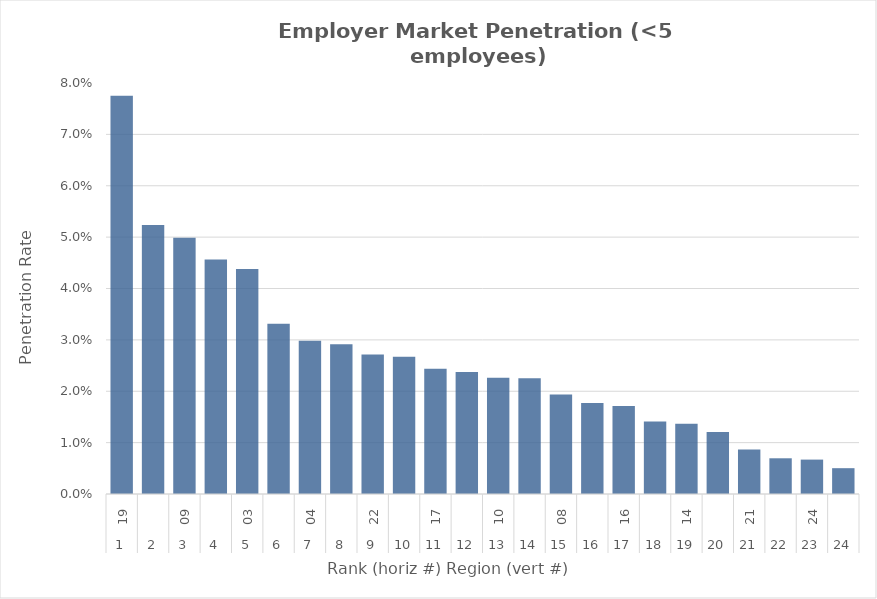
| Category | Rate |
|---|---|
| 0 | 0.078 |
| 1 | 0.052 |
| 2 | 0.05 |
| 3 | 0.046 |
| 4 | 0.044 |
| 5 | 0.033 |
| 6 | 0.03 |
| 7 | 0.029 |
| 8 | 0.027 |
| 9 | 0.027 |
| 10 | 0.024 |
| 11 | 0.024 |
| 12 | 0.023 |
| 13 | 0.023 |
| 14 | 0.019 |
| 15 | 0.018 |
| 16 | 0.017 |
| 17 | 0.014 |
| 18 | 0.014 |
| 19 | 0.012 |
| 20 | 0.009 |
| 21 | 0.007 |
| 22 | 0.007 |
| 23 | 0.005 |